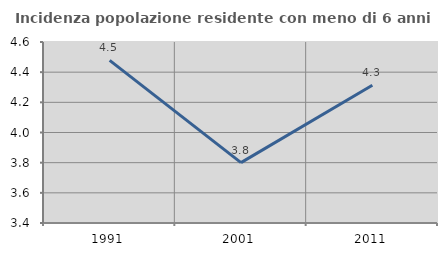
| Category | Incidenza popolazione residente con meno di 6 anni |
|---|---|
| 1991.0 | 4.478 |
| 2001.0 | 3.8 |
| 2011.0 | 4.313 |